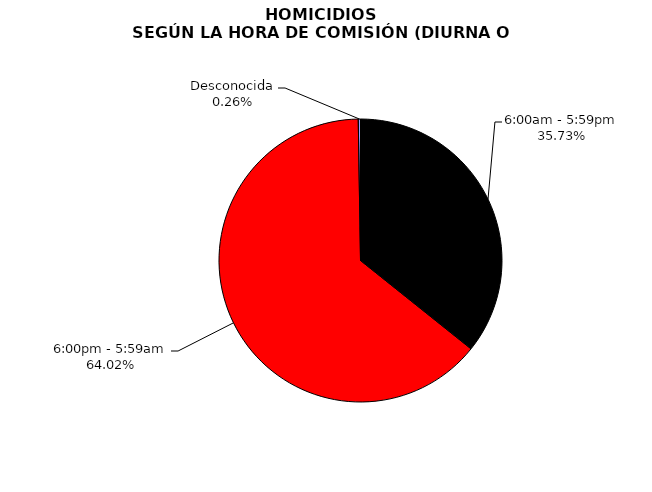
| Category | Series 0 |
|---|---|
| 6:00am - 5:59pm | 705 |
| 6:00pm - 5:59am | 1263 |
| Desconocida | 5 |